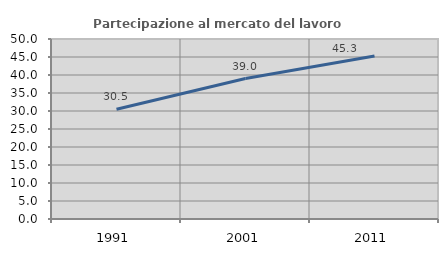
| Category | Partecipazione al mercato del lavoro  femminile |
|---|---|
| 1991.0 | 30.472 |
| 2001.0 | 39.02 |
| 2011.0 | 45.283 |